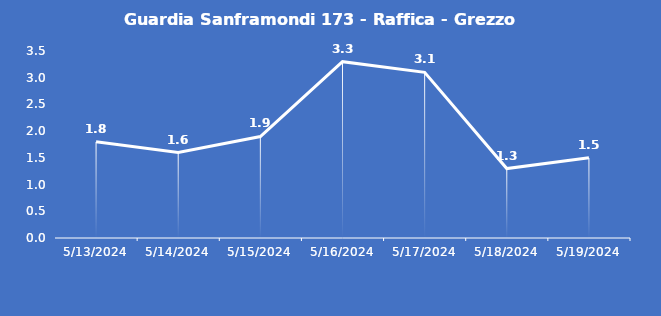
| Category | Guardia Sanframondi 173 - Raffica - Grezzo (m/s) |
|---|---|
| 5/13/24 | 1.8 |
| 5/14/24 | 1.6 |
| 5/15/24 | 1.9 |
| 5/16/24 | 3.3 |
| 5/17/24 | 3.1 |
| 5/18/24 | 1.3 |
| 5/19/24 | 1.5 |